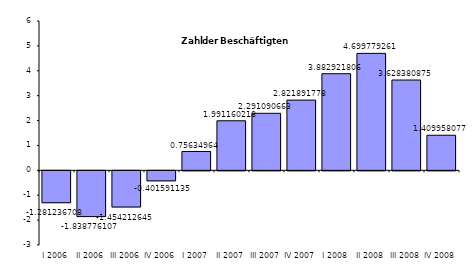
| Category | Series 0 |
|---|---|
| I 2006 | -1.281 |
| II 2006 | -1.839 |
| III 2006 | -1.454 |
| IV 2006 | -0.402 |
| I 2007 | 0.756 |
| II 2007 | 1.991 |
| III 2007 | 2.291 |
| IV 2007 | 2.822 |
| I 2008 | 3.883 |
| II 2008 | 4.7 |
| III 2008 | 3.628 |
| IV 2008 | 1.41 |